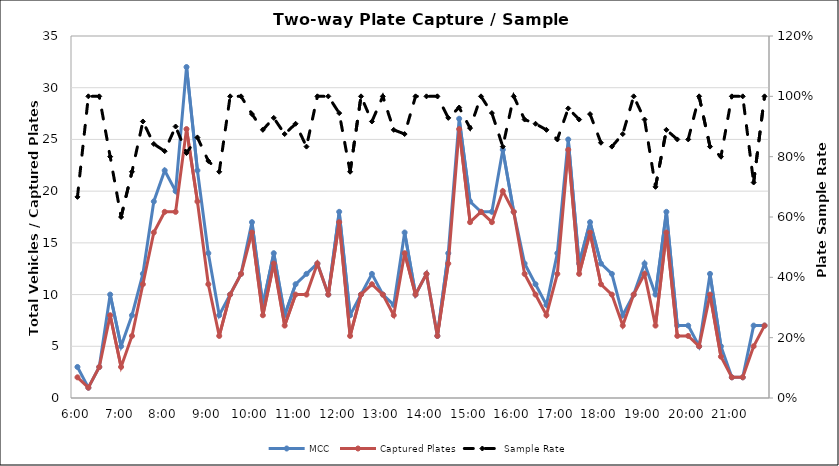
| Category | MCC | Captured Plates |
|---|---|---|
| 0.25 | 3 | 2 |
| 0.260416666666667 | 1 | 1 |
| 0.270833333333333 | 3 | 3 |
| 0.28125 | 10 | 8 |
| 0.291666666666667 | 5 | 3 |
| 0.302083333333333 | 8 | 6 |
| 0.3125 | 12 | 11 |
| 0.322916666666667 | 19 | 16 |
| 0.333333333333333 | 22 | 18 |
| 0.34375 | 20 | 18 |
| 0.354166666666667 | 32 | 26 |
| 0.364583333333333 | 22 | 19 |
| 0.375 | 14 | 11 |
| 0.385416666666667 | 8 | 6 |
| 0.395833333333333 | 10 | 10 |
| 0.40625 | 12 | 12 |
| 0.416666666666667 | 17 | 16 |
| 0.427083333333333 | 9 | 8 |
| 0.4375 | 14 | 13 |
| 0.447916666666667 | 8 | 7 |
| 0.458333333333333 | 11 | 10 |
| 0.46875 | 12 | 10 |
| 0.479166666666667 | 13 | 13 |
| 0.489583333333333 | 10 | 10 |
| 0.5 | 18 | 17 |
| 0.510416666666667 | 8 | 6 |
| 0.520833333333333 | 10 | 10 |
| 0.53125 | 12 | 11 |
| 0.541666666666667 | 10 | 10 |
| 0.552083333333333 | 9 | 8 |
| 0.5625 | 16 | 14 |
| 0.572916666666667 | 10 | 10 |
| 0.583333333333333 | 12 | 12 |
| 0.59375 | 6 | 6 |
| 0.604166666666667 | 14 | 13 |
| 0.614583333333333 | 27 | 26 |
| 0.625 | 19 | 17 |
| 0.635416666666667 | 18 | 18 |
| 0.645833333333333 | 18 | 17 |
| 0.65625 | 24 | 20 |
| 0.666666666666667 | 18 | 18 |
| 0.677083333333333 | 13 | 12 |
| 0.6875 | 11 | 10 |
| 0.697916666666667 | 9 | 8 |
| 0.708333333333333 | 14 | 12 |
| 0.71875 | 25 | 24 |
| 0.729166666666667 | 13 | 12 |
| 0.739583333333333 | 17 | 16 |
| 0.75 | 13 | 11 |
| 0.760416666666667 | 12 | 10 |
| 0.770833333333333 | 8 | 7 |
| 0.78125 | 10 | 10 |
| 0.791666666666667 | 13 | 12 |
| 0.802083333333333 | 10 | 7 |
| 0.8125 | 18 | 16 |
| 0.822916666666667 | 7 | 6 |
| 0.833333333333333 | 7 | 6 |
| 0.84375 | 5 | 5 |
| 0.854166666666667 | 12 | 10 |
| 0.864583333333333 | 5 | 4 |
| 0.875 | 2 | 2 |
| 0.885416666666667 | 2 | 2 |
| 0.895833333333333 | 7 | 5 |
| 0.90625 | 7 | 7 |